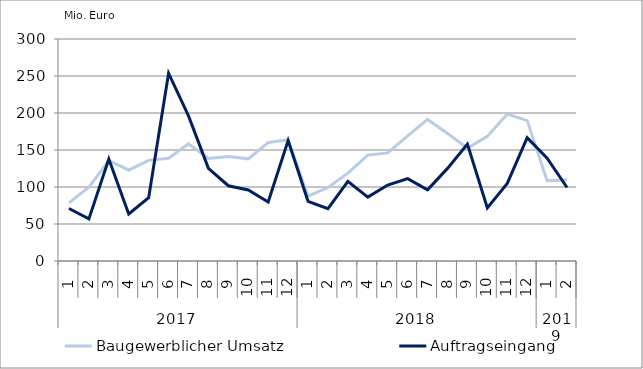
| Category | Baugewerblicher Umsatz | Auftragseingang |
|---|---|---|
| 0 | 78446.78 | 70908.903 |
| 1 | 99841.908 | 56868.408 |
| 2 | 135679.867 | 137790.423 |
| 3 | 123004.403 | 63637.761 |
| 4 | 136010.071 | 85644.63 |
| 5 | 138859.308 | 253791.552 |
| 6 | 158353.879 | 196034.198 |
| 7 | 138510.315 | 125319.873 |
| 8 | 141109.925 | 101690.626 |
| 9 | 138067.098 | 95966.626 |
| 10 | 160064.454 | 79701.993 |
| 11 | 163969.017 | 162878.607 |
| 12 | 87640.529 | 80684.627 |
| 13 | 99259.455 | 70746.763 |
| 14 | 118764.324 | 107538.747 |
| 15 | 143144.178 | 86374.619 |
| 16 | 146070.782 | 102661.329 |
| 17 | 169150.753 | 111287.709 |
| 18 | 191277.885 | 96286.662 |
| 19 | 172425.535 | 125142.495 |
| 20 | 152354.98 | 158112.302 |
| 21 | 168372.756 | 71808.619 |
| 22 | 198558.472 | 104904.147 |
| 23 | 189665.914 | 166653.461 |
| 24 | 108616.605 | 139065.287 |
| 25 | 109331.58 | 99318.609 |